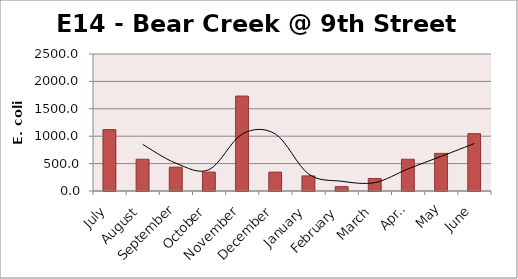
| Category | E. coli MPN |
|---|---|
| July | 1119.9 |
| August | 579.4 |
| September | 435.2 |
| October | 344.8 |
| November | 1732.9 |
| December | 344.8 |
| January | 275.5 |
| February | 79.8 |
| March | 228.2 |
| April | 579.4 |
| May | 686.7 |
| June | 1046.2 |